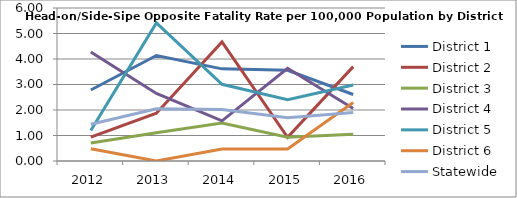
| Category | District 1 | District 2 | District 3 | District 4 | District 5 | District 6 | Statewide |
|---|---|---|---|---|---|---|---|
| 2012.0 | 2.785 | 0.939 | 0.704 | 4.274 | 1.199 | 0.477 | 1.441 |
| 2013.0 | 4.137 | 1.876 | 1.107 | 2.647 | 5.417 | 0 | 2.047 |
| 2014.0 | 3.613 | 4.671 | 1.492 | 1.575 | 3.008 | 0.471 | 2.019 |
| 2015.0 | 3.555 | 0.931 | 0.934 | 3.638 | 2.403 | 0.467 | 1.692 |
| 2016.0 | 2.608 | 3.701 | 1.046 | 2.062 | 2.98 | 2.291 | 1.901 |